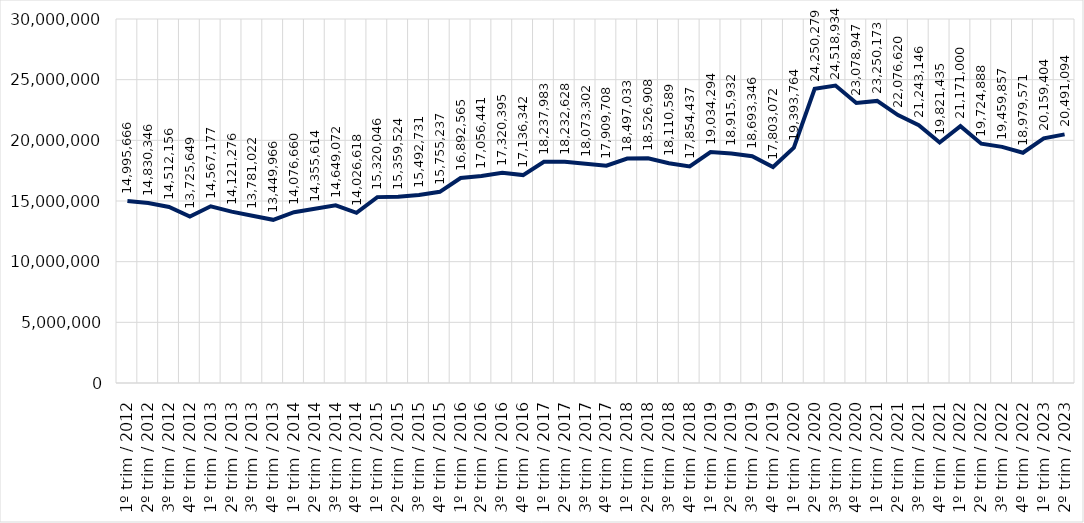
| Category | Conjunto das RMs |
|---|---|
| 1º trim / 2012 | 14995666 |
| 2º trim / 2012 | 14830346 |
| 3º trim / 2012 | 14512156 |
| 4º trim / 2012 | 13725649 |
| 1º trim / 2013 | 14567177 |
| 2º trim / 2013 | 14121276 |
| 3º trim / 2013 | 13781022 |
| 4º trim / 2013 | 13449966 |
| 1º trim / 2014 | 14076660 |
| 2º trim / 2014 | 14355614 |
| 3º trim / 2014 | 14649072 |
| 4º trim / 2014 | 14026618 |
| 1º trim / 2015 | 15320046 |
| 2º trim / 2015 | 15359524 |
| 3º trim / 2015 | 15492731 |
| 4º trim / 2015 | 15755237 |
| 1º trim / 2016 | 16892565 |
| 2º trim / 2016 | 17056441 |
| 3º trim / 2016 | 17320395 |
| 4º trim / 2016 | 17136342 |
| 1º trim / 2017 | 18237983 |
| 2º trim / 2017 | 18232628 |
| 3º trim / 2017 | 18073302 |
| 4º trim / 2017 | 17909708 |
| 1º trim / 2018 | 18497033 |
| 2º trim / 2018 | 18526908 |
| 3º trim / 2018 | 18110589 |
| 4º trim / 2018 | 17854437 |
| 1º trim / 2019 | 19034294 |
| 2º trim / 2019 | 18915932 |
| 3º trim / 2019 | 18693346 |
| 4º trim / 2019 | 17803072 |
| 1º trim / 2020 | 19393764 |
| 2º trim / 2020 | 24250279 |
| 3º trim / 2020 | 24518934 |
| 4º trim / 2020 | 23078947 |
| 1º trim / 2021 | 23250173 |
| 2º trim / 2021 | 22076620 |
| 3º trim / 2021 | 21243146 |
| 4º trim / 2021 | 19821435 |
| 1º trim / 2022 | 21171000 |
| 2º trim / 2022 | 19724888 |
| 3º trim / 2022 | 19459857 |
| 4º trim / 2022 | 18979571 |
| 1º trim / 2023 | 20159404 |
| 2º trim / 2023 | 20491094 |